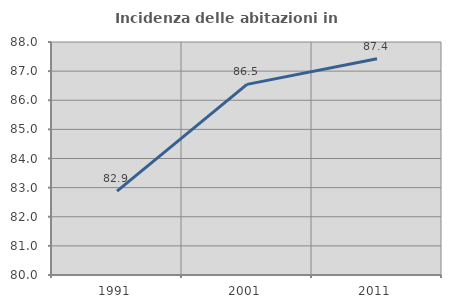
| Category | Incidenza delle abitazioni in proprietà  |
|---|---|
| 1991.0 | 82.881 |
| 2001.0 | 86.546 |
| 2011.0 | 87.422 |